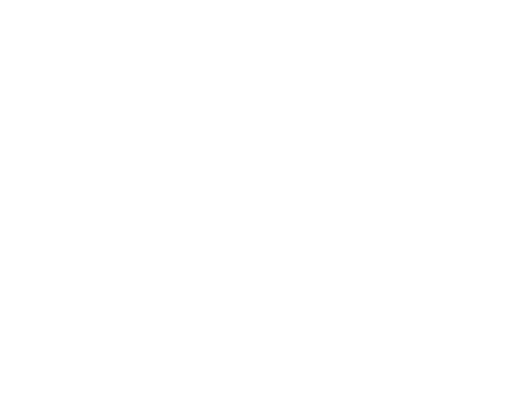
| Category | Series 0 | Series 1 | Series 2 |
|---|---|---|---|
| Impuestos | 19439732.65 | 0.082 |  |
| Cuotas y Aportaciones de Seguridad Social | 0 | 0 |  |
| Contribuciones de Mejoras | 51750 | 0 |  |
| Derechos | 88155501.28 | 0.37 |  |
| Productos | 0 | 0 |  |
| Aprovechamientos | 1231650 | 0.005 |  |
| Ingresos por Ventas de Bienes y Servicios | 0 | 0 |  |
| Participaciones y Aportaciones | 116750474.28 | 0.49 |  |
| Transferencias, Asignaciones, Subsidios y Otras Ayudas | 12517500 | 0.053 |  |
| Ingresos Derivados de Financiamientos | 0 | 0 |  |